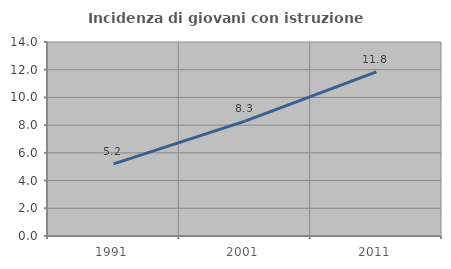
| Category | Incidenza di giovani con istruzione universitaria |
|---|---|
| 1991.0 | 5.202 |
| 2001.0 | 8.293 |
| 2011.0 | 11.846 |